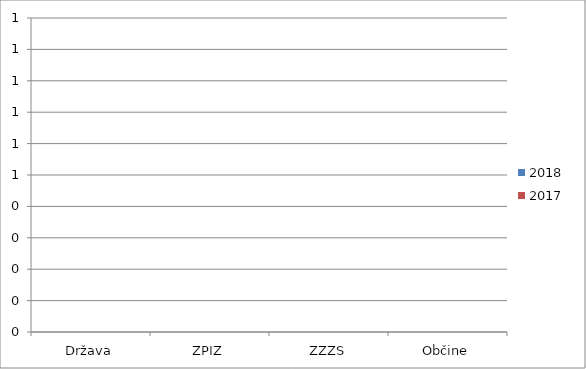
| Category | 2018 | 2017 |
|---|---|---|
| Država | 0 | 0 |
| ZPIZ | 0 | 0 |
| ZZZS | 0 | 0 |
| Občine | 0 | 0 |